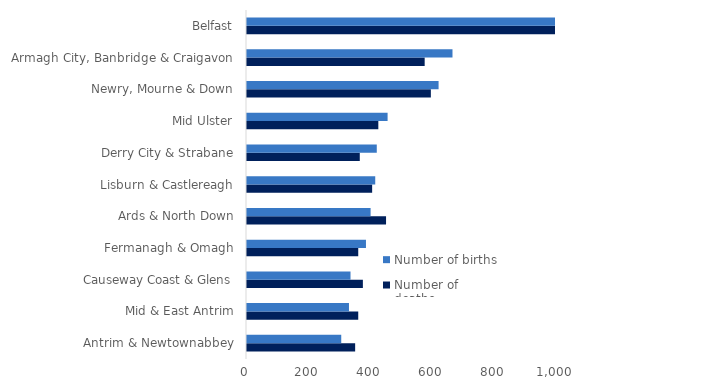
| Category | Number of deaths | Number of births |
|---|---|---|
| Antrim & Newtownabbey | 350 | 305 |
| Mid & East Antrim | 360 | 330 |
| Causeway Coast & Glens | 375 | 335 |
| Fermanagh & Omagh | 360 | 385 |
| Ards & North Down | 450 | 400 |
| Lisburn & Castlereagh | 405 | 415 |
| Derry City & Strabane | 365 | 420 |
| Mid Ulster | 425 | 455 |
| Newry, Mourne & Down | 595 | 620 |
| Armagh City, Banbridge & Craigavon | 575 | 665 |
| Belfast | 1030 | 1055 |